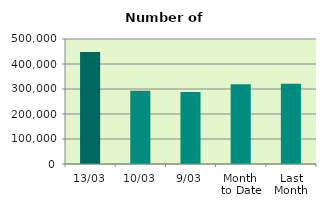
| Category | Series 0 |
|---|---|
| 13/03 | 448302 |
| 10/03 | 292618 |
| 9/03 | 288476 |
| Month 
to Date | 319008.222 |
| Last
Month | 321374.6 |